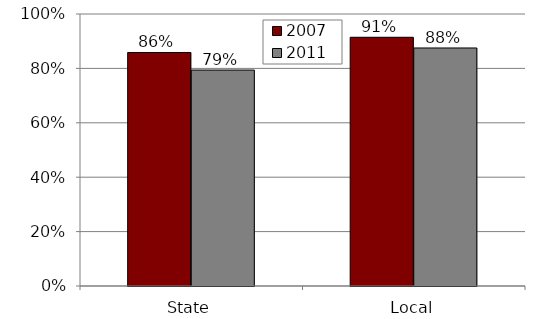
| Category | 2007 | 2011 |
|---|---|---|
| State | 0.858 | 0.794 |
| Local | 0.914 | 0.875 |